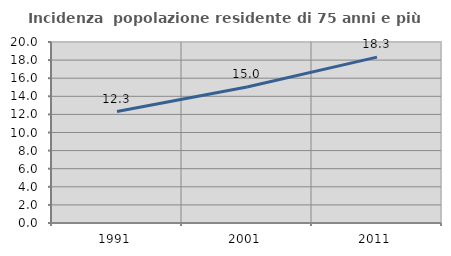
| Category | Incidenza  popolazione residente di 75 anni e più |
|---|---|
| 1991.0 | 12.317 |
| 2001.0 | 15.026 |
| 2011.0 | 18.329 |